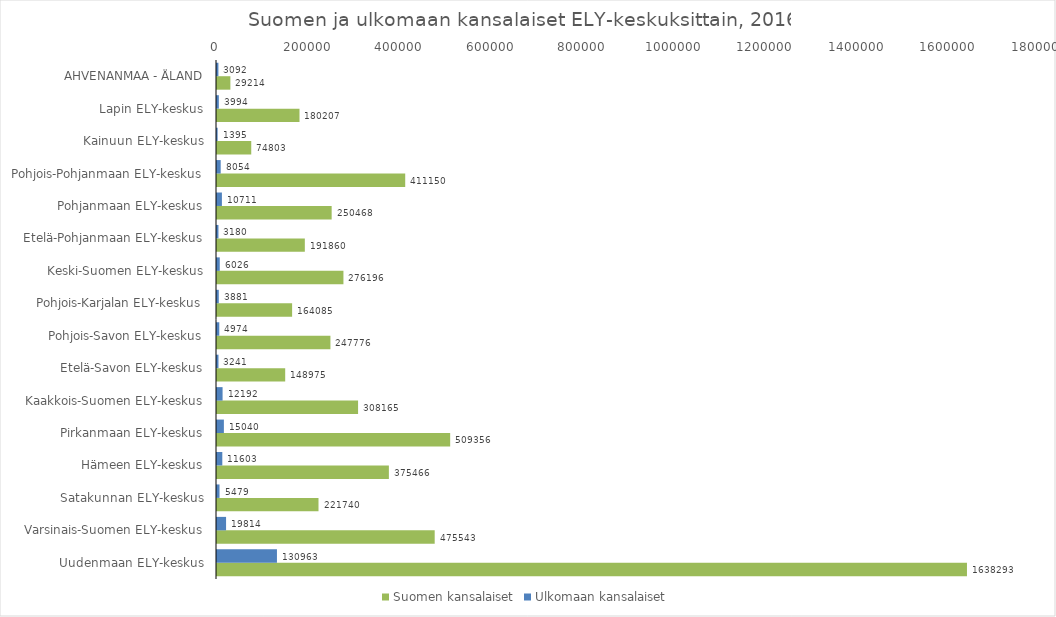
| Category | Suomen kansalaiset | Ulkomaan kansalaiset |
|---|---|---|
| Uudenmaan ELY-keskus | 1638293 | 130963 |
| Varsinais-Suomen ELY-keskus | 475543 | 19814 |
| Satakunnan ELY-keskus | 221740 | 5479 |
| Hämeen ELY-keskus | 375466 | 11603 |
| Pirkanmaan ELY-keskus | 509356 | 15040 |
| Kaakkois-Suomen ELY-keskus | 308165 | 12192 |
| Etelä-Savon ELY-keskus | 148975 | 3241 |
| Pohjois-Savon ELY-keskus | 247776 | 4974 |
| Pohjois-Karjalan ELY-keskus | 164085 | 3881 |
| Keski-Suomen ELY-keskus | 276196 | 6026 |
| Etelä-Pohjanmaan ELY-keskus | 191860 | 3180 |
| Pohjanmaan ELY-keskus | 250468 | 10711 |
| Pohjois-Pohjanmaan ELY-keskus | 411150 | 8054 |
| Kainuun ELY-keskus | 74803 | 1395 |
| Lapin ELY-keskus | 180207 | 3994 |
| AHVENANMAA - ÅLAND | 29214 | 3092 |